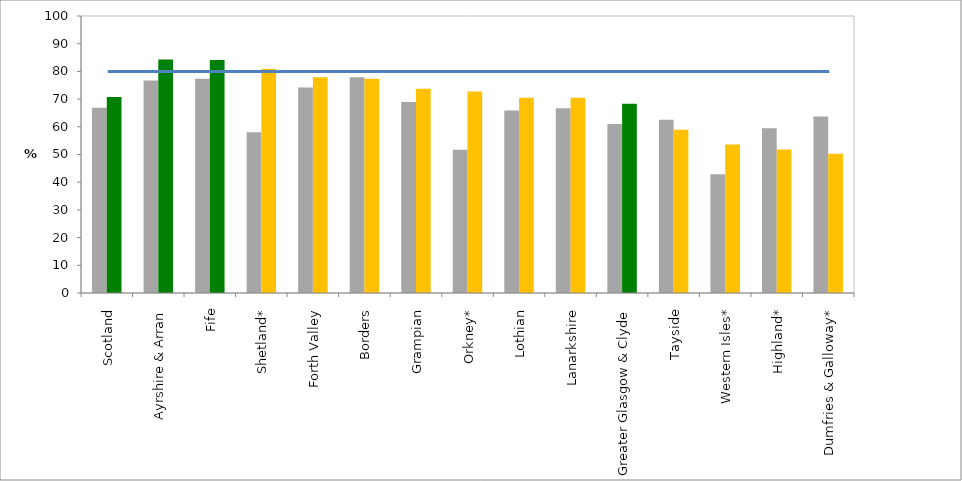
| Category | 2016 (%) | 2017 (%) |
|---|---|---|
| Scotland | 66.836 | 70.782 |
|  Ayrshire & Arran | 76.747 | 84.332 |
|  Fife | 77.358 | 84.091 |
|  Shetland* | 58.065 | 80.952 |
|  Forth Valley | 74.169 | 77.892 |
|  Borders | 77.907 | 77.372 |
|  Grampian | 68.971 | 73.748 |
|  Orkney* | 51.724 | 72.727 |
|  Lothian | 65.843 | 70.486 |
|  Lanarkshire | 66.667 | 70.448 |
|  Greater Glasgow & Clyde | 61.022 | 68.297 |
|  Tayside | 62.573 | 58.915 |
|  Western Isles* | 42.857 | 53.571 |
|  Highland* | 59.459 | 51.795 |
|  Dumfries & Galloway* | 63.69 | 50.286 |